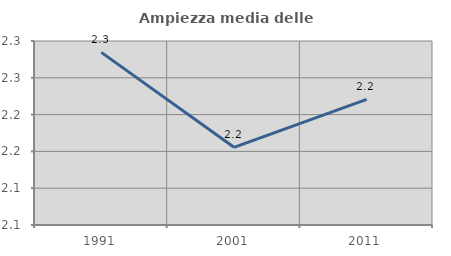
| Category | Ampiezza media delle famiglie |
|---|---|
| 1991.0 | 2.285 |
| 2001.0 | 2.156 |
| 2011.0 | 2.221 |